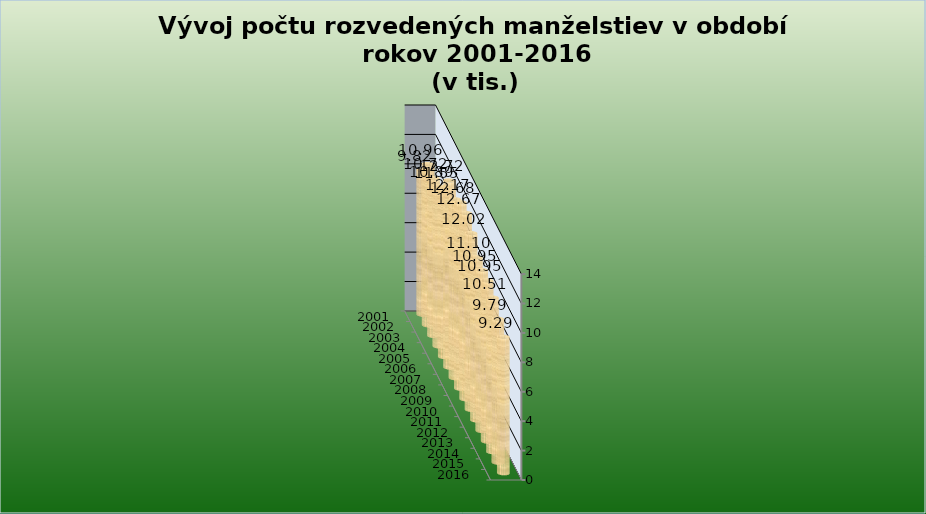
| Category | Series 1 |
|---|---|
| 2001.0 | 9.82 |
| 2002.0 | 10.96 |
| 2003.0 | 10.72 |
| 2004.0 | 10.89 |
| 2005.0 | 11.55 |
| 2006.0 | 12.72 |
| 2007.0 | 12.17 |
| 2008.0 | 12.68 |
| 2009.0 | 12.67 |
| 2010.0 | 12.02 |
| 2011.0 | 11.1 |
| 2012.0 | 10.95 |
| 2013.0 | 10.95 |
| 2014.0 | 10.51 |
| 2015.0 | 9.786 |
| 2016.0 | 9.286 |